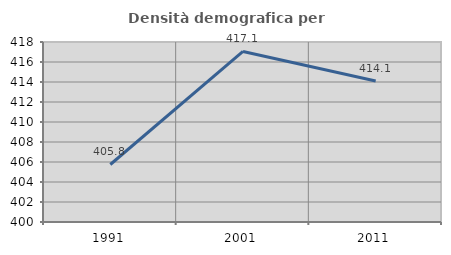
| Category | Densità demografica |
|---|---|
| 1991.0 | 405.751 |
| 2001.0 | 417.056 |
| 2011.0 | 414.107 |